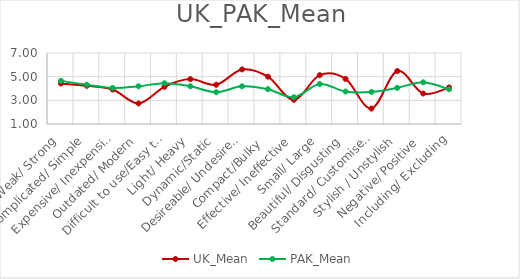
| Category | UK_Mean | PAK_Mean |
|---|---|---|
| Weak/ Strong | 4.423 | 4.645 |
| Complicated/ Simple | 4.225 | 4.318 |
| Expensive/ Inexpensive | 3.91 | 4.051 |
| Outdated/ Modern | 2.739 | 4.19 |
| Difficult to use/Easy to use | 4.144 | 4.446 |
| Light/ Heavy | 4.793 | 4.188 |
| Dynamic/Static | 4.315 | 3.691 |
| Desireable/ Undesireable | 5.613 | 4.186 |
| Compact/Bulky  | 5 | 3.943 |
| Effective/ Ineffective | 3.045 | 3.263 |
| Small/ Large | 5.126 | 4.38 |
| Beautiful/ Disgusting | 4.811 | 3.746 |
| Standard/ Customised   | 2.306 | 3.713 |
| Stylish / Unstylish | 5.477 | 4.055 |
| Negative/ Positive | 3.577 | 4.523 |
| Including/ Excluding | 4.09 | 3.938 |